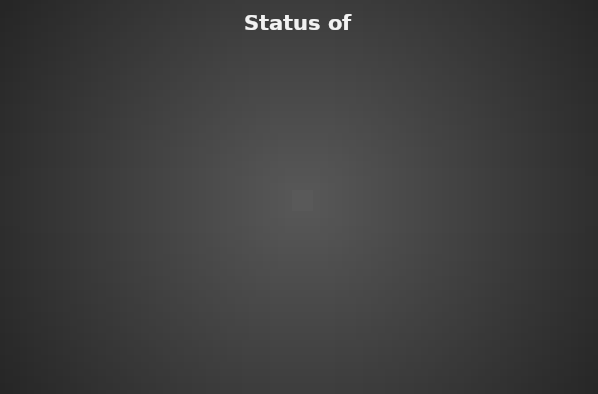
| Category | Series 0 |
|---|---|
| %age of Students Passed | 0 |
| %age of Students need improvement | 0 |